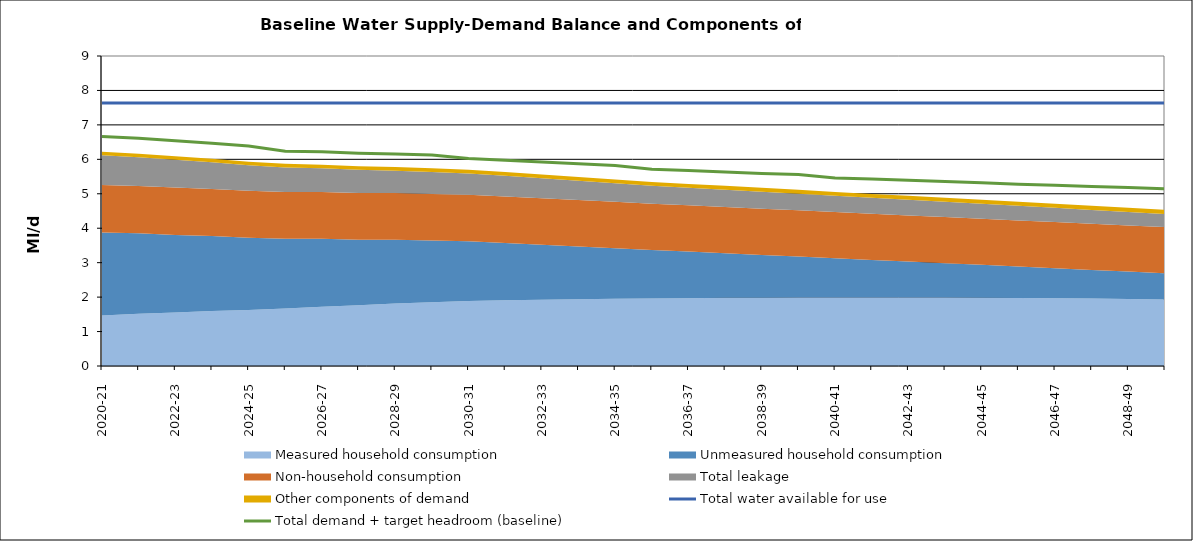
| Category | Total water available for use | Total demand + target headroom (baseline) |
|---|---|---|
| 0 | 7.638 | 6.666 |
| 1 | 7.638 | 6.614 |
| 2 | 7.638 | 6.537 |
| 3 | 7.638 | 6.47 |
| 4 | 7.638 | 6.387 |
| 5 | 7.638 | 6.234 |
| 6 | 7.638 | 6.217 |
| 7 | 7.638 | 6.177 |
| 8 | 7.638 | 6.157 |
| 9 | 7.638 | 6.126 |
| 10 | 7.638 | 6.027 |
| 11 | 7.638 | 5.977 |
| 12 | 7.638 | 5.924 |
| 13 | 7.638 | 5.871 |
| 14 | 7.638 | 5.822 |
| 15 | 7.638 | 5.71 |
| 16 | 7.638 | 5.673 |
| 17 | 7.638 | 5.635 |
| 18 | 7.638 | 5.591 |
| 19 | 7.638 | 5.558 |
| 20 | 7.638 | 5.461 |
| 21 | 7.638 | 5.427 |
| 22 | 7.638 | 5.395 |
| 23 | 7.638 | 5.354 |
| 24 | 7.638 | 5.321 |
| 25 | 7.638 | 5.279 |
| 26 | 7.638 | 5.247 |
| 27 | 7.638 | 5.213 |
| 28 | 7.638 | 5.179 |
| 29 | 7.638 | 5.144 |